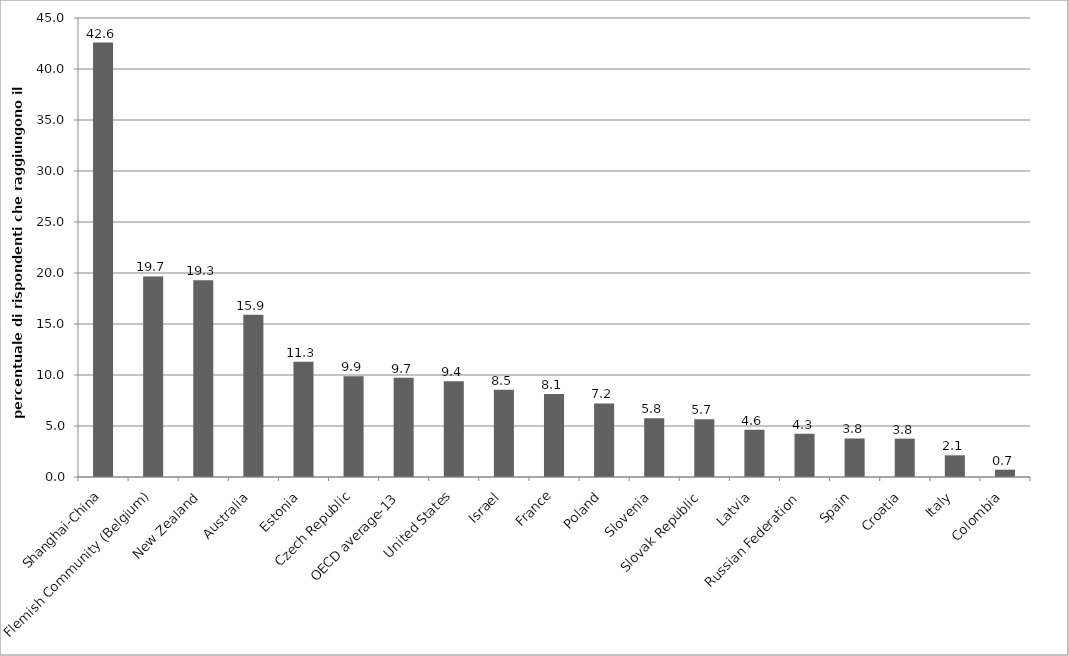
| Category | Series 0 |
|---|---|
| Shanghai-China | 42.588 |
| Flemish Community (Belgium) | 19.667 |
| New Zealand | 19.291 |
| Australia | 15.908 |
| Estonia | 11.307 |
| Czech Republic | 9.869 |
| OECD average-13 | 9.74 |
| United States | 9.392 |
| Israel | 8.545 |
| France | 8.127 |
| Poland | 7.209 |
| Slovenia | 5.757 |
| Slovak Republic | 5.651 |
| Latvia | 4.625 |
| Russian Federation | 4.25 |
| Spain | 3.775 |
| Croatia | 3.762 |
| Italy | 2.126 |
| Colombia | 0.715 |